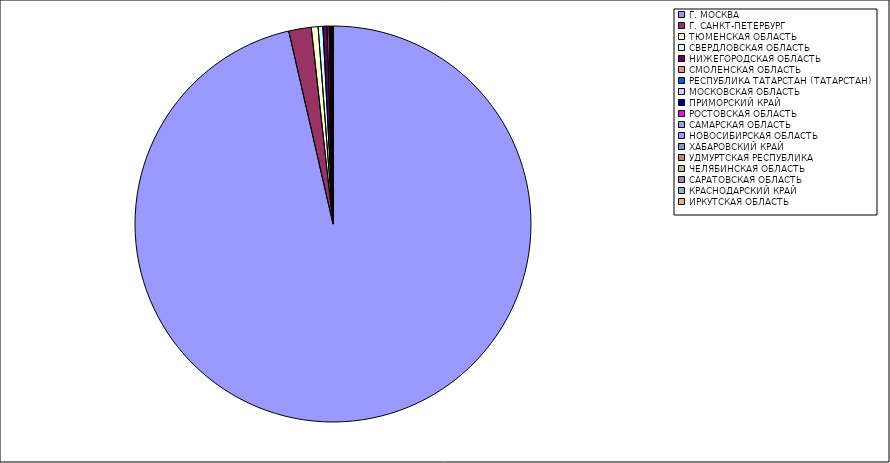
| Category | Оборот |
|---|---|
| Г. МОСКВА | 96.343 |
| Г. САНКТ-ПЕТЕРБУРГ | 1.833 |
| ТЮМЕНСКАЯ ОБЛАСТЬ | 0.556 |
| СВЕРДЛОВСКАЯ ОБЛАСТЬ | 0.384 |
| НИЖЕГОРОДСКАЯ ОБЛАСТЬ | 0.343 |
| СМОЛЕНСКАЯ ОБЛАСТЬ | 0.151 |
| РЕСПУБЛИКА ТАТАРСТАН (ТАТАРСТАН) | 0.074 |
| МОСКОВСКАЯ ОБЛАСТЬ | 0.047 |
| ПРИМОРСКИЙ КРАЙ | 0.042 |
| РОСТОВСКАЯ ОБЛАСТЬ | 0.038 |
| САМАРСКАЯ ОБЛАСТЬ | 0.037 |
| НОВОСИБИРСКАЯ ОБЛАСТЬ | 0.037 |
| ХАБАРОВСКИЙ КРАЙ | 0.012 |
| УДМУРТСКАЯ РЕСПУБЛИКА | 0.01 |
| ЧЕЛЯБИНСКАЯ ОБЛАСТЬ | 0.009 |
| САРАТОВСКАЯ ОБЛАСТЬ | 0.006 |
| КРАСНОДАРСКИЙ КРАЙ | 0.006 |
| ИРКУТСКАЯ ОБЛАСТЬ | 0.005 |